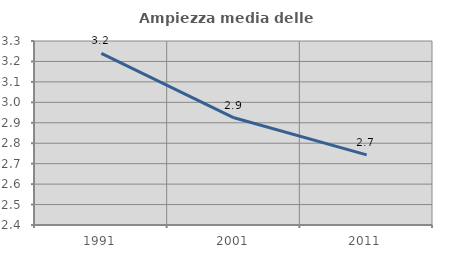
| Category | Ampiezza media delle famiglie |
|---|---|
| 1991.0 | 3.239 |
| 2001.0 | 2.924 |
| 2011.0 | 2.743 |